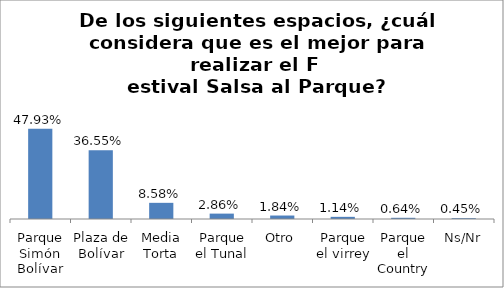
| Category | Total |
|---|---|
| Parque Simón Bolívar | 0.479 |
| Plaza de Bolívar | 0.366 |
| Media Torta | 0.086 |
| Parque el Tunal | 0.029 |
| Otro | 0.018 |
| Parque el virrey | 0.011 |
| Parque el Country | 0.006 |
| Ns/Nr | 0.004 |